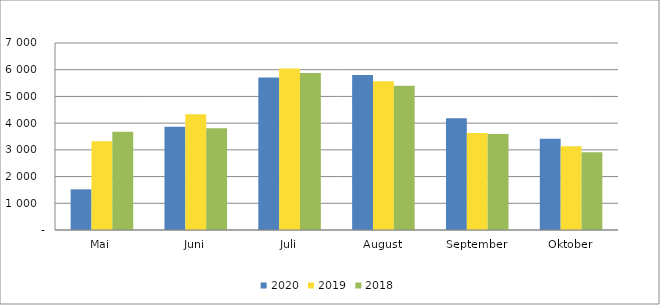
| Category | 2020 | 2019 | 2018 |
|---|---|---|---|
| Mai | 1522840 | 3318785 | 3676675 |
| Juni | 3867643 | 4335688 | 3811829 |
| Juli | 5709434 | 6044743 | 5874375 |
| August | 5802579 | 5567222 | 5395326 |
| September | 4183912 | 3633060 | 3597256 |
| Oktober | 3419058 | 3138683 | 2907416 |